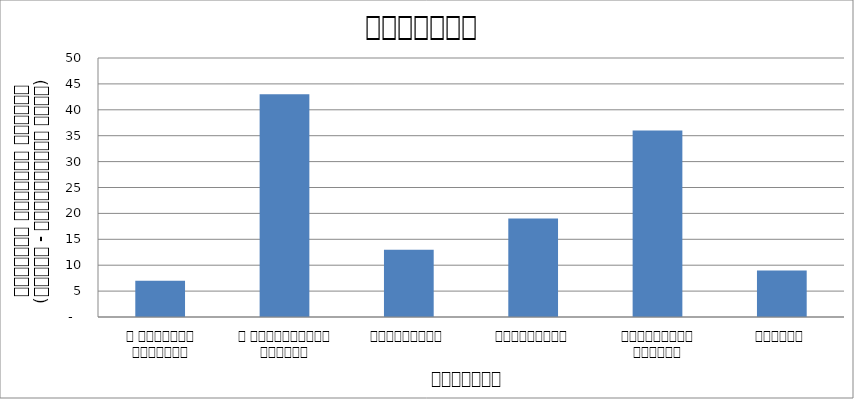
| Category | कुटनीति |
|---|---|
| द हिमालयन टाइम्स् | 7 |
| द काठमाण्डौं पोस्ट् | 43 |
| रिपब्लिका | 13 |
| कान्तिपुर | 19 |
| अन्नपूर्ण पोस्ट् | 36 |
| नागरिक | 9 |